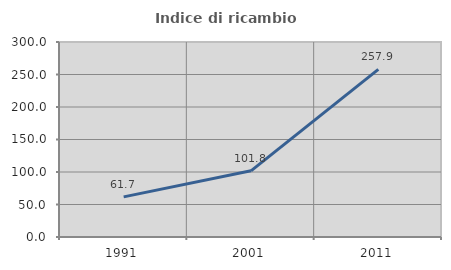
| Category | Indice di ricambio occupazionale  |
|---|---|
| 1991.0 | 61.693 |
| 2001.0 | 101.813 |
| 2011.0 | 257.851 |